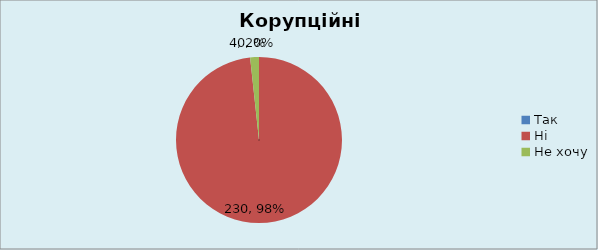
| Category | Кількість | % |
|---|---|---|
| Так | 0 | 0 |
| Ні | 230 | 0.983 |
| Не хочу | 4 | 0.017 |